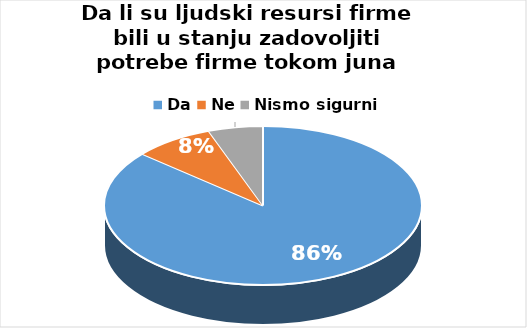
| Category | Series 0 |
|---|---|
| Da | 295 |
| Ne | 28 |
| Nismo sigurni | 19 |